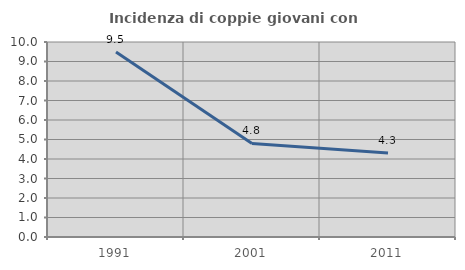
| Category | Incidenza di coppie giovani con figli |
|---|---|
| 1991.0 | 9.489 |
| 2001.0 | 4.8 |
| 2011.0 | 4.31 |